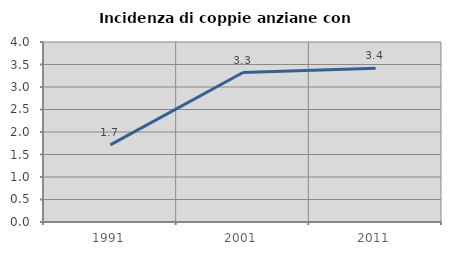
| Category | Incidenza di coppie anziane con figli |
|---|---|
| 1991.0 | 1.714 |
| 2001.0 | 3.321 |
| 2011.0 | 3.417 |